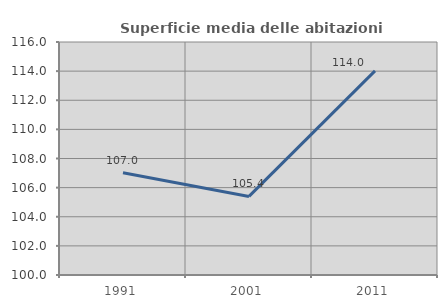
| Category | Superficie media delle abitazioni occupate |
|---|---|
| 1991.0 | 107.026 |
| 2001.0 | 105.396 |
| 2011.0 | 114.016 |